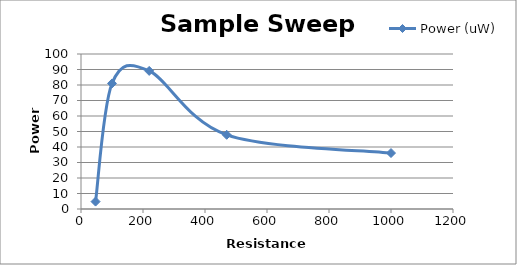
| Category | Power (uW) |
|---|---|
| 47.0 | 4.787 |
| 100.0 | 81 |
| 220.0 | 89.091 |
| 470.0 | 47.872 |
| 1000.0 | 36.1 |